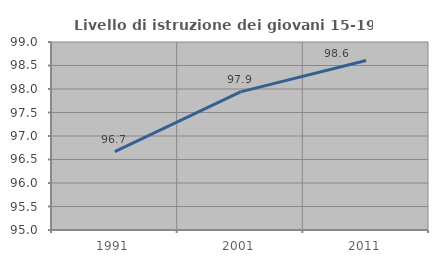
| Category | Livello di istruzione dei giovani 15-19 anni |
|---|---|
| 1991.0 | 96.666 |
| 2001.0 | 97.938 |
| 2011.0 | 98.607 |